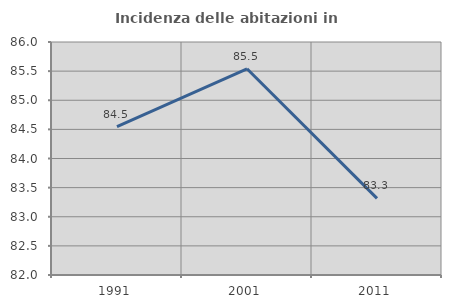
| Category | Incidenza delle abitazioni in proprietà  |
|---|---|
| 1991.0 | 84.548 |
| 2001.0 | 85.54 |
| 2011.0 | 83.316 |